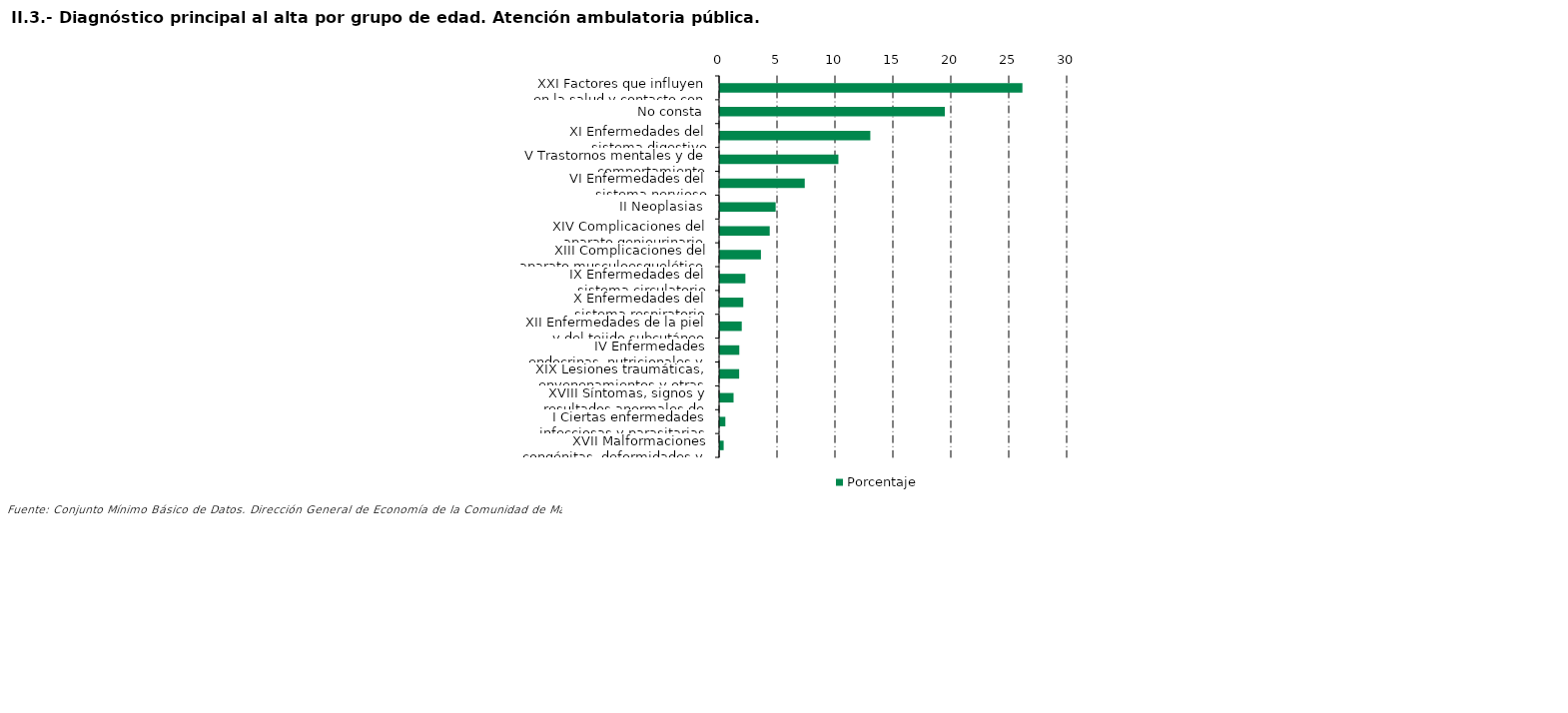
| Category | Porcentaje |
|---|---|
| XXI Factores que influyen en la salud y contacto con los servicios sanitarios | 26.096 |
| No consta | 19.4 |
| XI Enfermedades del sistema digestivo | 12.967 |
| V Trastornos mentales y de comportamiento | 10.212 |
| VI Enfermedades del sistema nervioso | 7.308 |
| II Neoplasias | 4.797 |
| XIV Complicaciones del aparato geniourinario | 4.285 |
| XIII Complicaciones del aparato musculoesquelético y del tejido conectivo | 3.526 |
| IX Enfermedades del sistema circulatorio | 2.186 |
| X Enfermedades del sistema respiratorio | 2.003 |
| XII Enfermedades de la piel y del tejido subcutáneo | 1.871 |
| IV Enfermedades endocrinas, nutricionales y metabólicas | 1.66 |
| XIX Lesiones traumáticas, envenenamientos y otras consecuencias de causas externas | 1.648 |
| XVIII Síntomas, signos y resultados anormales de pruebas complementarias, no clasificados bajo otro concepto | 1.164 |
| I Ciertas enfermedades infecciosas y parasitarias | 0.456 |
| XVII Malformaciones congénitas, deformidades y anomalías cromosómicas | 0.309 |